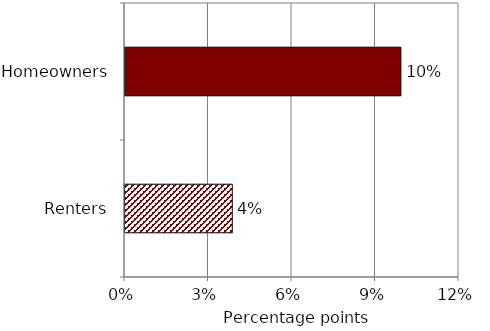
| Category | Series 0 |
|---|---|
| Renters | 3.854 |
| Homeowners | 9.912 |